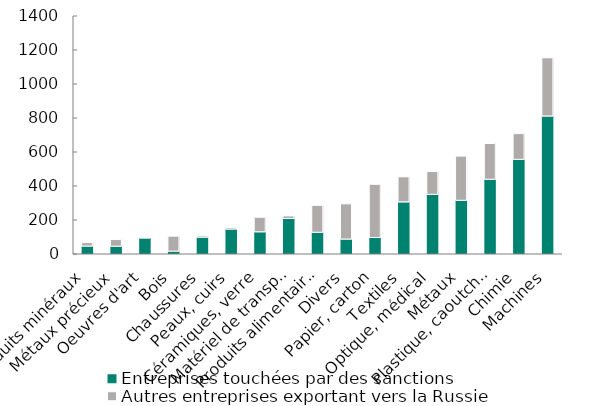
| Category | Entreprises touchées par des sanctions | Autres entreprises exportant vers la Russie |
|---|---|---|
| Produits minéraux | 44 | 23 |
| Métaux précieux | 43 | 42 |
| Oeuvres d'art | 93 | 1 |
| Bois | 14 | 91 |
| Chaussures | 96 | 11 |
| Peaux, cuirs | 144 | 12 |
| Céramiques, verre | 128 | 88 |
| Matériel de transport | 206 | 18 |
| Produits alimentaires | 125 | 161 |
| Divers | 85 | 210 |
| Papier, carton | 94 | 316 |
| Textiles | 304 | 150 |
| Optique, médical | 348 | 137 |
| Métaux | 313 | 263 |
| Plastique, caoutchouc | 437 | 213 |
| Chimie | 554 | 154 |
| Machines | 809 | 345 |